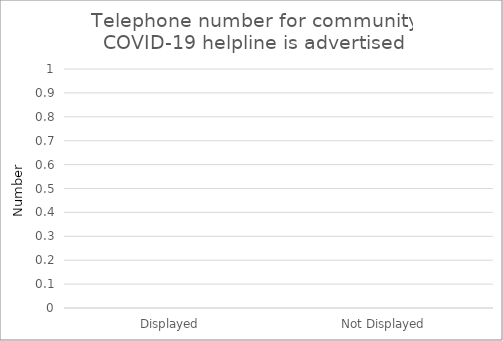
| Category | Telephone number for community COVID-19 helpline is advertised |
|---|---|
| Displayed | 0 |
| Not Displayed | 0 |